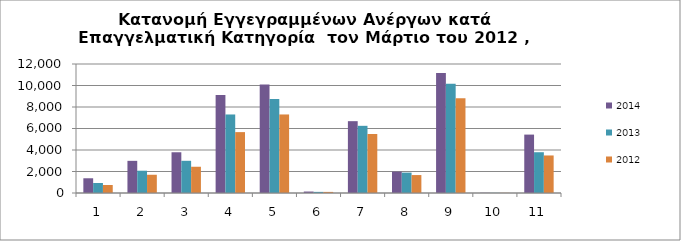
| Category | 2014 | 2013 | 2012 |
|---|---|---|---|
| 1.0 | 1370 | 931 | 744 |
| 2.0 | 2991 | 2073 | 1697 |
| 3.0 | 3790 | 2996 | 2442 |
| 4.0 | 9114 | 7305 | 5664 |
| 5.0 | 10084 | 8751 | 7306 |
| 6.0 | 136 | 104 | 102 |
| 7.0 | 6682 | 6249 | 5491 |
| 8.0 | 1992 | 1898 | 1669 |
| 9.0 | 11159 | 10168 | 8823 |
| 10.0 | 21 | 15 | 13 |
| 11.0 | 5433 | 3793 | 3492 |